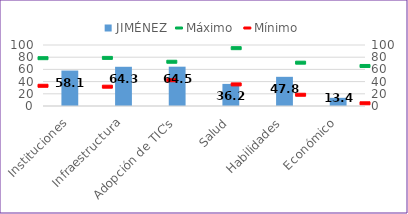
| Category | JIMÉNEZ |
|---|---|
| Instituciones | 58.106 |
| Infraestructura | 64.29 |
| Adopción de TIC's | 64.457 |
| Salud | 36.228 |
| Habilidades | 47.831 |
| Económico | 13.405 |